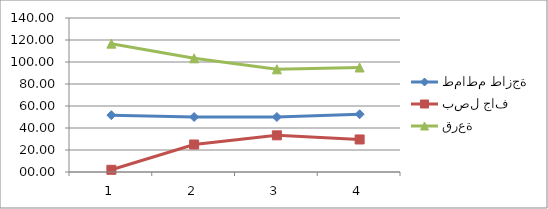
| Category | طماطم طازجة | بصل جاف | قرعة |
|---|---|---|---|
| 0 | 51.67 | 2 | 116.67 |
| 1 | 50 | 25 | 103.33 |
| 2 | 50 | 33.33 | 93.33 |
| 3 | 52.5 | 29.58 | 95 |